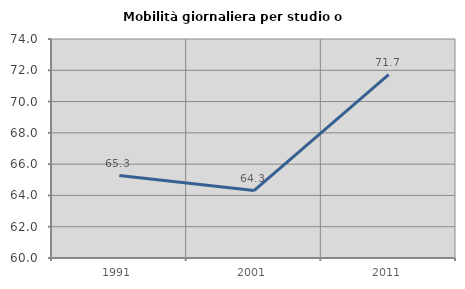
| Category | Mobilità giornaliera per studio o lavoro |
|---|---|
| 1991.0 | 65.269 |
| 2001.0 | 64.308 |
| 2011.0 | 71.724 |